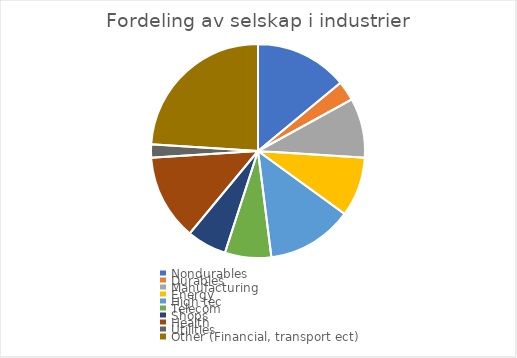
| Category | Series 0 |
|---|---|
| Nondurables  | 0.14 |
| Durables  | 0.03 |
| Manufacturing  | 0.09 |
| Energy  | 0.09 |
| High tec  | 0.13 |
| Telecom  | 0.07 |
| Shops  | 0.06 |
| Health   | 0.13 |
| Utilities  | 0.02 |
| Other (Financial, transport ect)  | 0.24 |